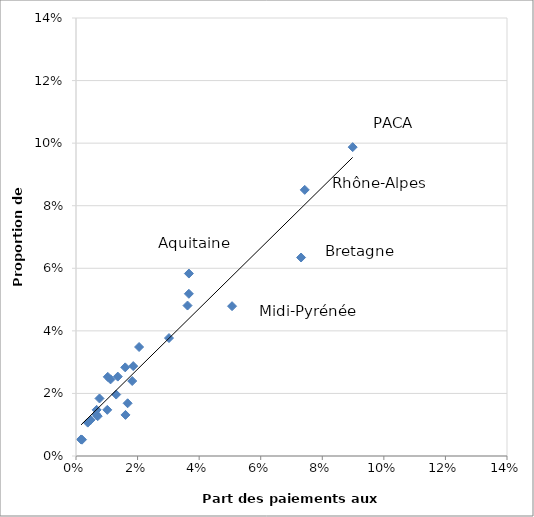
| Category | Bretagne Provence-Alpes-Côte d'Azur Rhône-Alpes Midi-Pyrénées Aquitaine Languedoc-Roussillon Pays-de-la-Loire Centre Lorraine Alsace Collectivités d'Outre-Mer Nord-Pas-de-Calais Auvergne Basse-Normandie Poitou-Charentes Martinique Guyane Champagne-Ardenne |
|---|---|
| 0.07310721618370085 | 0.063 |
| 0.08987164482490362 | 0.099 |
| 0.07429945675221156 | 0.085 |
| 0.05069365913236313 | 0.048 |
| 0.036674661844806784 | 0.058 |
| 0.018586539715385493 | 0.029 |
| 0.020492677293003622 | 0.035 |
| 0.030205365243874033 | 0.038 |
| 0.03622424862653248 | 0.048 |
| 0.015990664975288872 | 0.028 |
| 0.03666320359384741 | 0.052 |
| 0.01826131372190805 | 0.024 |
| 0.016769946870061177 | 0.017 |
| 0.01607533150661195 | 0.013 |
| 0.013579966440466525 | 0.025 |
| 0.010160387217424736 | 0.015 |
| 0.01305683152053582 | 0.02 |
| 0.01032507366322353 | 0.025 |
| 0.011227308574456172 | 0.024 |
| 0.007053445667261466 | 0.013 |
| 0.007636932258750327 | 0.018 |
| 0.006574683679912995 | 0.013 |
| 0.0066974710427536435 | 0.015 |
| 0.0038203099213285855 | 0.011 |
| 0.004772200241657513 | 0.012 |
| 0.0019525082051605573 | 0.005 |
| 0.0016384024317903781 | 0.005 |